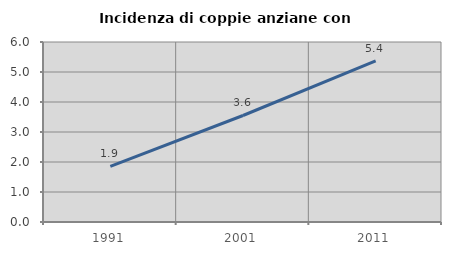
| Category | Incidenza di coppie anziane con figli |
|---|---|
| 1991.0 | 1.852 |
| 2001.0 | 3.55 |
| 2011.0 | 5.369 |